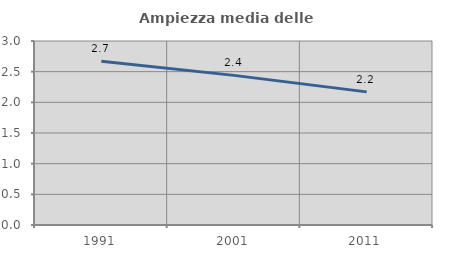
| Category | Ampiezza media delle famiglie |
|---|---|
| 1991.0 | 2.668 |
| 2001.0 | 2.44 |
| 2011.0 | 2.171 |